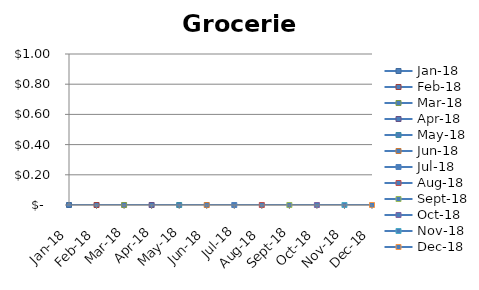
| Category | Groceries |
|---|---|
| 2018-01-01 | 0 |
| 2018-02-01 | 0 |
| 2018-03-01 | 0 |
| 2018-04-01 | 0 |
| 2018-05-01 | 0 |
| 2018-06-01 | 0 |
| 2018-07-01 | 0 |
| 2018-08-01 | 0 |
| 2018-09-01 | 0 |
| 2018-10-01 | 0 |
| 2018-11-01 | 0 |
| 2018-12-01 | 0 |